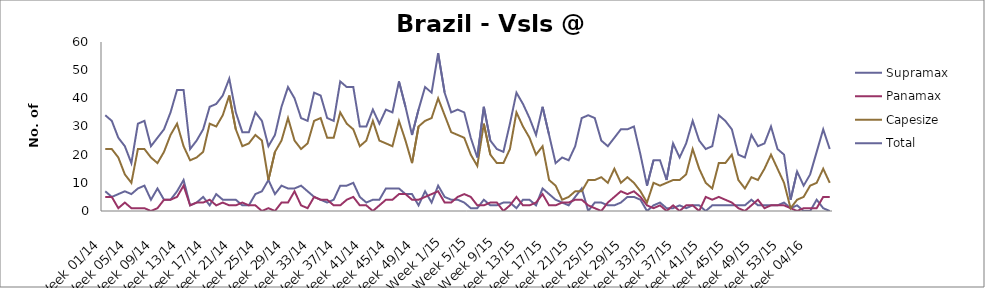
| Category | Supramax | Panamax | Capesize | Total |
|---|---|---|---|---|
| Week 01/14 | 7 | 5 | 22 | 34 |
| Week 02/14 | 5 | 5 | 22 | 32 |
| Week 03/14 | 6 | 1 | 19 | 26 |
| Week 04/14 | 7 | 3 | 13 | 23 |
| Week 05/14 | 6 | 1 | 10 | 17 |
| Week 06/14 | 8 | 1 | 22 | 31 |
| Week 07/14 | 9 | 1 | 22 | 32 |
| Week 08/14 | 4 | 0 | 19 | 23 |
| Week 09/14 | 8 | 1 | 17 | 26 |
| Week 10/14 | 4 | 4 | 21 | 29 |
| Week 11/14 | 4 | 4 | 27 | 35 |
| Week 12/14 | 7 | 5 | 31 | 43 |
| Week 13/14 | 11 | 9 | 23 | 43 |
| Week 14/14 | 2 | 2 | 18 | 22 |
| Week 15/14 | 3 | 3 | 19 | 25 |
| Week 16/14 | 5 | 3 | 21 | 29 |
| Week 17/14 | 2 | 4 | 31 | 37 |
| Week 18/14 | 6 | 2 | 30 | 38 |
| Week 19/14 | 4 | 3 | 34 | 41 |
| Week 20/14 | 4 | 2 | 41 | 47 |
| Week 21/14 | 4 | 2 | 29 | 35 |
| Week 22/14 | 2 | 3 | 23 | 28 |
| Week 23/14 | 2 | 2 | 24 | 28 |
| Week 24/14 | 6 | 2 | 27 | 35 |
| Week 25/14 | 7 | 0 | 25 | 32 |
| Week 26/14 | 11 | 1 | 11 | 23 |
| Week 27/14 | 6 | 0 | 21 | 27 |
| Week 28/14 | 9 | 3 | 25 | 37 |
| Week 29/14 | 8 | 3 | 33 | 44 |
| Week 30/14 | 8 | 7 | 25 | 40 |
| Week 31/14 | 9 | 2 | 22 | 33 |
| Week 32/14 | 7 | 1 | 24 | 32 |
| Week 33/14 | 5 | 5 | 32 | 42 |
| Week 34/14 | 4 | 4 | 33 | 41 |
| Week 35/14 | 3 | 4 | 26 | 33 |
| Week 36/14 | 4 | 2 | 26 | 32 |
| Week 37/14 | 9 | 2 | 35 | 46 |
| Week 38/14 | 9 | 4 | 31 | 44 |
| Week 39/14 | 10 | 5 | 29 | 44 |
| Week 40/14 | 5 | 2 | 23 | 30 |
| Week 41/14 | 3 | 2 | 25 | 30 |
| Week 42/14 | 4 | 0 | 32 | 36 |
| Week 43/14 | 4 | 2 | 25 | 31 |
| Week 44/14 | 8 | 4 | 24 | 36 |
| Week 45/14 | 8 | 4 | 23 | 35 |
| Week 46/14 | 8 | 6 | 32 | 46 |
| Week 47/14 | 6 | 6 | 25 | 37 |
| Week 48/14 | 6 | 4 | 17 | 27 |
| Week 49/14 | 2 | 4 | 30 | 36 |
| Week 50/14 | 7 | 5 | 32 | 44 |
| Week 51/14 | 3 | 6 | 33 | 42 |
| Week 52/14 | 9 | 7 | 40 | 56 |
| Week 1/15 | 5 | 3 | 34 | 42 |
| Week 2/15 | 4 | 3 | 28 | 35 |
| Week 3/15 | 4 | 5 | 27 | 36 |
| Week 4/15 | 3 | 6 | 26 | 35 |
| Week 5/15 | 1 | 5 | 20 | 26 |
| Week 6/15 | 1 | 2 | 16 | 19 |
| Week 7/15 | 4 | 2 | 31 | 37 |
| Week 8/15 | 2 | 3 | 20 | 25 |
| Week 9/15 | 2 | 3 | 17 | 22 |
| Week 10/15 | 3 | 0 | 17 | 21 |
| Week 11/15 | 3 | 2 | 22 | 31 |
| Week 12/15 | 1 | 5 | 35 | 42 |
| Week 13/15 | 4 | 2 | 30 | 38 |
| Week 14/15 | 4 | 2 | 26 | 33 |
| Week 15/15 | 2 | 3 | 20 | 27 |
| Week 16/15 | 8 | 6 | 23 | 37 |
| Week 17/15 | 6 | 2 | 11 | 27 |
| Week 18/15 | 4 | 2 | 9 | 17 |
| Week 19/15 | 3 | 3 | 4 | 19 |
| Week 20/15 | 2 | 3 | 5 | 18 |
| Week 21/15 | 5 | 4 | 7 | 23 |
| Week 22/15 | 8 | 4 | 7 | 33 |
| Week 23/15 | 0 | 2 | 11 | 34 |
| Week 24/15 | 3 | 1 | 11 | 33 |
| Week 25/15 | 3 | 0 | 12 | 25 |
| Week 26/15 | 2 | 3 | 10 | 23 |
| Week 27/15 | 2 | 5 | 15 | 26 |
| Week 28/15 | 3 | 7 | 10 | 29 |
| Week 29/15 | 5 | 6 | 12 | 29 |
| Week 30/15 | 5 | 7 | 10 | 30 |
| Week 31/15 | 4 | 5 | 7 | 20 |
| Week 32/15 | 0 | 2 | 3 | 9 |
| Week 33/15 | 2 | 1 | 10 | 18 |
| Week 34/15 | 3 | 2 | 9 | 18 |
| Week 35/15 | 1 | 0 | 10 | 11 |
| Week 36/15 | 1 | 2 | 11 | 24 |
| Week 37/15 | 2 | 0 | 11 | 19 |
| Week 38/15 | 1 | 2 | 13 | 24 |
| Week 39/15 | 2 | 2 | 22 | 32 |
| Week 40/15 | 2 | 0 | 15 | 25 |
| Week 41/15 | 0 | 5 | 10 | 22 |
| Week 42/15 | 2 | 4 | 8 | 23 |
| Week 43/15 | 2 | 5 | 17 | 34 |
| Week 44/15 | 2 | 4 | 17 | 32 |
| Week 45/15 | 2 | 3 | 20 | 29 |
| Week 46/15 | 2 | 1 | 11 | 20 |
| Week 47/15 | 2 | 0 | 8 | 19 |
| Week 48/15 | 4 | 2 | 12 | 27 |
| Week 49/15 | 2 | 4 | 11 | 23 |
| Week 50/15 | 2 | 1 | 15 | 24 |
| Week 51/15 | 2 | 2 | 20 | 30 |
| Week 52/15 | 2 | 2 | 15 | 22 |
| Week 53/15 | 3 | 2 | 10 | 20 |
| Week 01/16 | 1 | 1 | 1 | 4 |
| Week 02/16 | 2 | 0 | 4 | 14 |
| Week 03/16 | 0 | 1 | 5 | 9 |
| Week 04/16 | 0 | 1 | 9 | 13 |
| Week 05/16 | 4 | 1 | 10 | 21 |
| Week 06/16 | 1 | 5 | 15 | 29 |